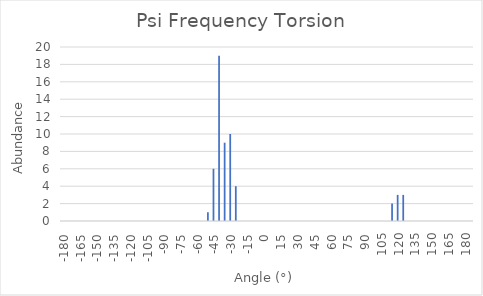
| Category | Series 0 |
|---|---|
| -180.0 | 0 |
| -175.0 | 0 |
| -170.0 | 0 |
| -165.0 | 0 |
| -160.0 | 0 |
| -155.0 | 0 |
| -150.0 | 0 |
| -145.0 | 0 |
| -140.0 | 0 |
| -135.0 | 0 |
| -130.0 | 0 |
| -125.0 | 0 |
| -120.0 | 0 |
| -115.0 | 0 |
| -110.0 | 0 |
| -105.0 | 0 |
| -100.0 | 0 |
| -95.0 | 0 |
| -90.0 | 0 |
| -85.0 | 0 |
| -80.0 | 0 |
| -75.0 | 0 |
| -70.0 | 0 |
| -65.0 | 0 |
| -60.0 | 0 |
| -55.0 | 0 |
| -50.0 | 1 |
| -45.0 | 6 |
| -40.0 | 19 |
| -35.0 | 9 |
| -30.0 | 10 |
| -25.0 | 4 |
| -20.0 | 0 |
| -15.0 | 0 |
| -10.0 | 0 |
| -5.0 | 0 |
| 0.0 | 0 |
| 5.0 | 0 |
| 10.0 | 0 |
| 15.0 | 0 |
| 20.0 | 0 |
| 25.0 | 0 |
| 30.0 | 0 |
| 35.0 | 0 |
| 40.0 | 0 |
| 45.0 | 0 |
| 50.0 | 0 |
| 55.0 | 0 |
| 60.0 | 0 |
| 65.0 | 0 |
| 70.0 | 0 |
| 75.0 | 0 |
| 80.0 | 0 |
| 85.0 | 0 |
| 90.0 | 0 |
| 95.0 | 0 |
| 100.0 | 0 |
| 105.0 | 0 |
| 110.0 | 0 |
| 115.0 | 2 |
| 120.0 | 3 |
| 125.0 | 3 |
| 130.0 | 0 |
| 135.0 | 0 |
| 140.0 | 0 |
| 145.0 | 0 |
| 150.0 | 0 |
| 155.0 | 0 |
| 160.0 | 0 |
| 165.0 | 0 |
| 170.0 | 0 |
| 175.0 | 0 |
| 180.0 | 0 |